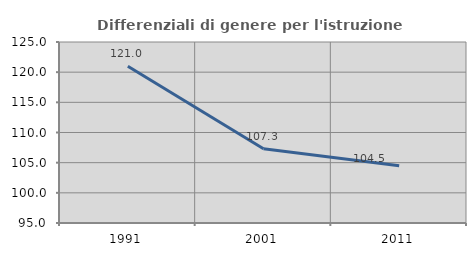
| Category | Differenziali di genere per l'istruzione superiore |
|---|---|
| 1991.0 | 120.975 |
| 2001.0 | 107.321 |
| 2011.0 | 104.495 |